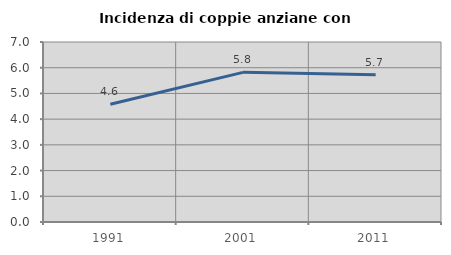
| Category | Incidenza di coppie anziane con figli |
|---|---|
| 1991.0 | 4.578 |
| 2001.0 | 5.819 |
| 2011.0 | 5.727 |